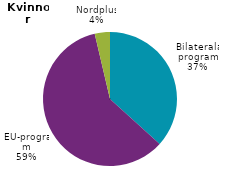
| Category | Series 0 |
|---|---|
| Utbytesprogram | 0 |
| Bilaterala program | 2773 |
| EU-program | 4504 |
| Nordplus | 277 |